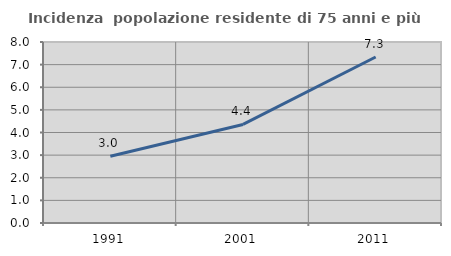
| Category | Incidenza  popolazione residente di 75 anni e più |
|---|---|
| 1991.0 | 2.954 |
| 2001.0 | 4.357 |
| 2011.0 | 7.337 |